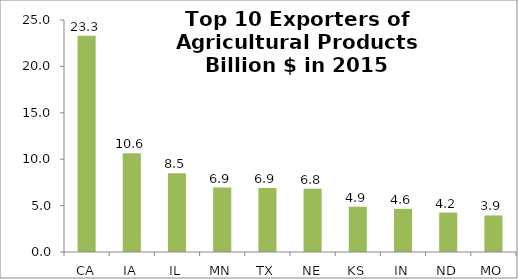
| Category | Total agricultural exports |
|---|---|
| CA | 23.305 |
| IA | 10.647 |
| IL | 8.488 |
| MN | 6.943 |
| TX | 6.883 |
| NE | 6.802 |
| KS | 4.882 |
| IN | 4.649 |
| ND | 4.246 |
| MO | 3.939 |